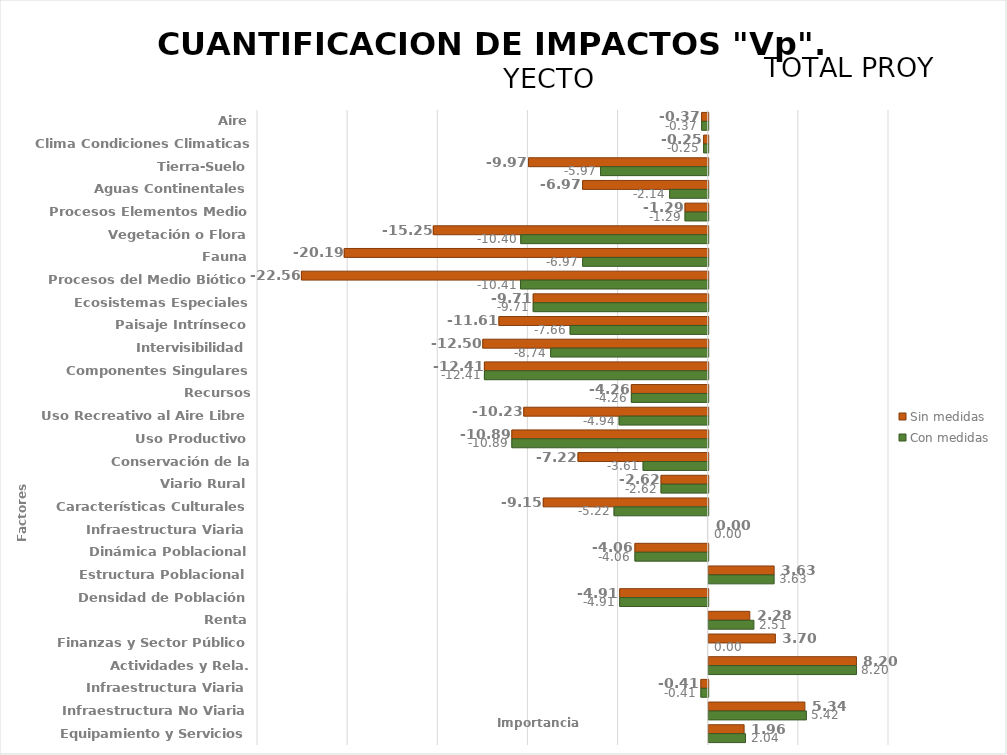
| Category | Sin medidas | Con medidas |
|---|---|---|
| Aire | -0.365 | -0.365 |
| Clima Condiciones Climaticas | -0.254 | -0.254 |
| Tierra-Suelo | -9.965 | -5.97 |
| Aguas Continentales | -6.965 | -2.137 |
| Procesos Elementos Medio | -1.286 | -1.286 |
| Vegetación o Flora | -15.248 | -10.398 |
| Fauna | -20.189 | -6.965 |
| Procesos del Medio Biótico | -22.564 | -10.413 |
| Ecosistemas Especiales | -9.707 | -9.707 |
| Paisaje Intrínseco | -11.609 | -7.659 |
| Intervisibilidad | -12.504 | -8.739 |
| Componentes Singulares Paisaje | -12.413 | -12.413 |
| Recursos Científico-Culturales | -4.262 | -4.262 |
| Uso Recreativo al Aire Libre | -10.231 | -4.942 |
| Uso Productivo | -10.892 | -10.892 |
| Conservación de la Naturaleza | -7.221 | -3.611 |
| Viario Rural | -2.616 | -2.616 |
| Características Culturales | -9.148 | -5.222 |
| Infraestructura Viaria | 0 | 0 |
| Dinámica Poblacional | -4.063 | -4.063 |
| Estructura Poblacional | 3.629 | 3.629 |
| Densidad de Población | -4.908 | -4.908 |
| Renta | 2.279 | 2.507 |
| Finanzas y Sector Público | 3.698 | 0 |
| Actividades y Rela. Económicas | 8.195 | 8.195 |
| Infraestructura Viaria | -0.407 | -0.407 |
| Infraestructura No Viaria | 5.335 | 5.419 |
| Equipamiento y Servicios | 1.963 | 2.042 |